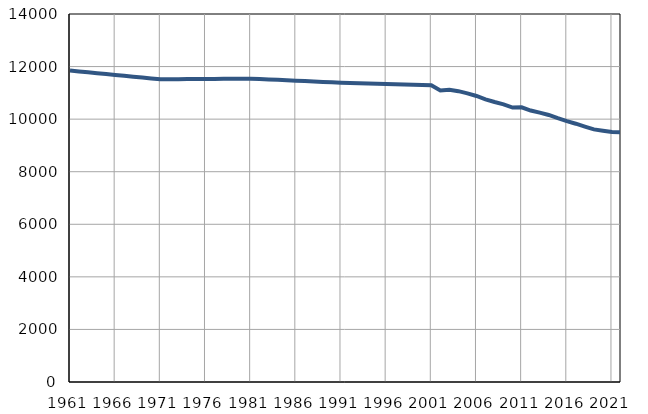
| Category | Population
size |
|---|---|
| 1961.0 | 11848 |
| 1962.0 | 11815 |
| 1963.0 | 11781 |
| 1964.0 | 11748 |
| 1965.0 | 11715 |
| 1966.0 | 11682 |
| 1967.0 | 11648 |
| 1968.0 | 11615 |
| 1969.0 | 11582 |
| 1970.0 | 11548 |
| 1971.0 | 11515 |
| 1972.0 | 11518 |
| 1973.0 | 11520 |
| 1974.0 | 11523 |
| 1975.0 | 11525 |
| 1976.0 | 11528 |
| 1977.0 | 11531 |
| 1978.0 | 11533 |
| 1979.0 | 11536 |
| 1980.0 | 11538 |
| 1981.0 | 11541 |
| 1982.0 | 11525 |
| 1983.0 | 11510 |
| 1984.0 | 11494 |
| 1985.0 | 11478 |
| 1986.0 | 11462 |
| 1987.0 | 11447 |
| 1988.0 | 11431 |
| 1989.0 | 11415 |
| 1990.0 | 11400 |
| 1991.0 | 11384 |
| 1992.0 | 11375 |
| 1993.0 | 11366 |
| 1994.0 | 11356 |
| 1995.0 | 11347 |
| 1996.0 | 11338 |
| 1997.0 | 11329 |
| 1998.0 | 11320 |
| 1999.0 | 11311 |
| 2000.0 | 11301 |
| 2001.0 | 11292 |
| 2002.0 | 11093 |
| 2003.0 | 11119 |
| 2004.0 | 11064 |
| 2005.0 | 10980 |
| 2006.0 | 10882 |
| 2007.0 | 10755 |
| 2008.0 | 10651 |
| 2009.0 | 10565 |
| 2010.0 | 10442 |
| 2011.0 | 10449 |
| 2012.0 | 10326 |
| 2013.0 | 10247 |
| 2014.0 | 10159 |
| 2015.0 | 10037 |
| 2016.0 | 9925 |
| 2017.0 | 9826 |
| 2018.0 | 9717 |
| 2019.0 | 9610 |
| 2020.0 | 9561 |
| 2021.0 | 9509 |
| 2022.0 | 9504 |